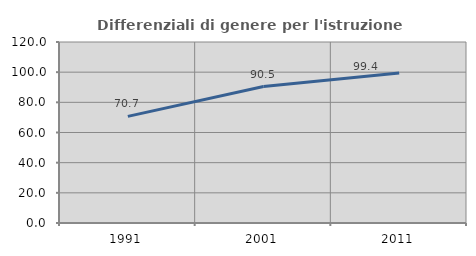
| Category | Differenziali di genere per l'istruzione superiore |
|---|---|
| 1991.0 | 70.713 |
| 2001.0 | 90.483 |
| 2011.0 | 99.392 |